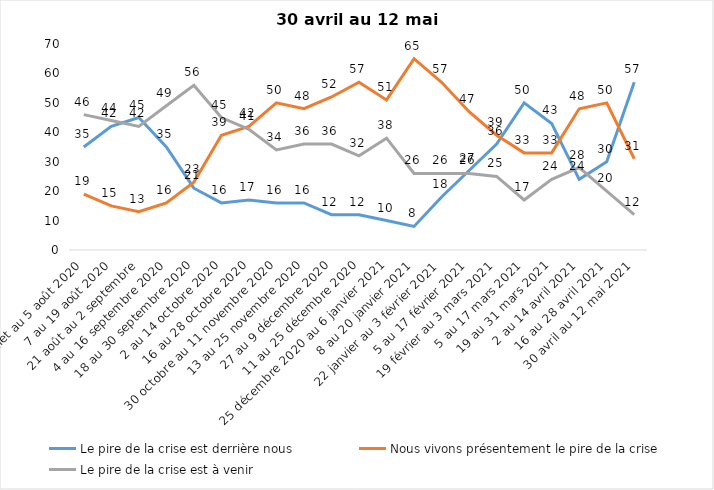
| Category | Le pire de la crise est derrière nous | Nous vivons présentement le pire de la crise | Le pire de la crise est à venir |
|---|---|---|---|
| 24 juillet au 5 août 2020 | 35 | 19 | 46 |
| 7 au 19 août 2020 | 42 | 15 | 44 |
| 21 août au 2 septembre | 45 | 13 | 42 |
| 4 au 16 septembre 2020 | 35 | 16 | 49 |
| 18 au 30 septembre 2020 | 21 | 23 | 56 |
| 2 au 14 octobre 2020 | 16 | 39 | 45 |
| 16 au 28 octobre 2020 | 17 | 42 | 41 |
| 30 octobre au 11 novembre 2020 | 16 | 50 | 34 |
| 13 au 25 novembre 2020 | 16 | 48 | 36 |
| 27 au 9 décembre 2020 | 12 | 52 | 36 |
| 11 au 25 décembre 2020 | 12 | 57 | 32 |
| 25 décembre 2020 au 6 janvier 2021 | 10 | 51 | 38 |
| 8 au 20 janvier 2021 | 8 | 65 | 26 |
| 22 janvier au 3 février 2021 | 18 | 57 | 26 |
| 5 au 17 février 2021 | 27 | 47 | 26 |
| 19 février au 3 mars 2021 | 36 | 39 | 25 |
| 5 au 17 mars 2021 | 50 | 33 | 17 |
| 19 au 31 mars 2021 | 43 | 33 | 24 |
| 2 au 14 avril 2021 | 24 | 48 | 28 |
| 16 au 28 avril 2021 | 30 | 50 | 20 |
| 30 avril au 12 mai 2021 | 57 | 31 | 12 |